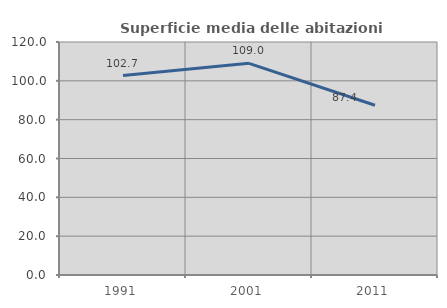
| Category | Superficie media delle abitazioni occupate |
|---|---|
| 1991.0 | 102.687 |
| 2001.0 | 109.018 |
| 2011.0 | 87.42 |